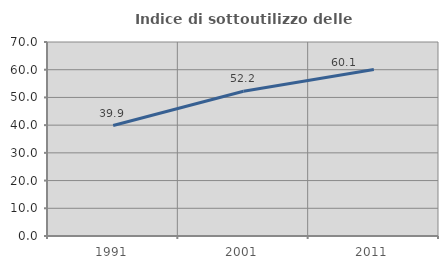
| Category | Indice di sottoutilizzo delle abitazioni  |
|---|---|
| 1991.0 | 39.86 |
| 2001.0 | 52.206 |
| 2011.0 | 60.088 |